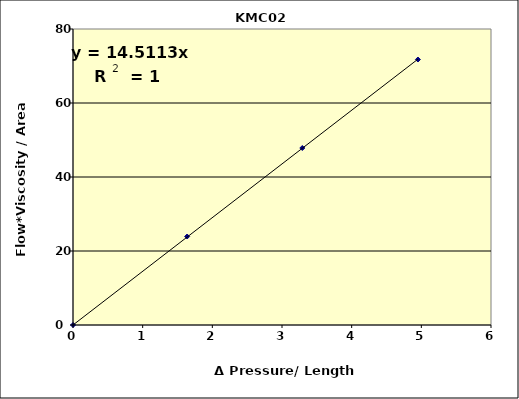
| Category | Series 0 |
|---|---|
| 0.0 | 0 |
| 1.638440817765245 | 23.917 |
| 3.2912882974973554 | 47.835 |
| 4.951185477617201 | 71.752 |